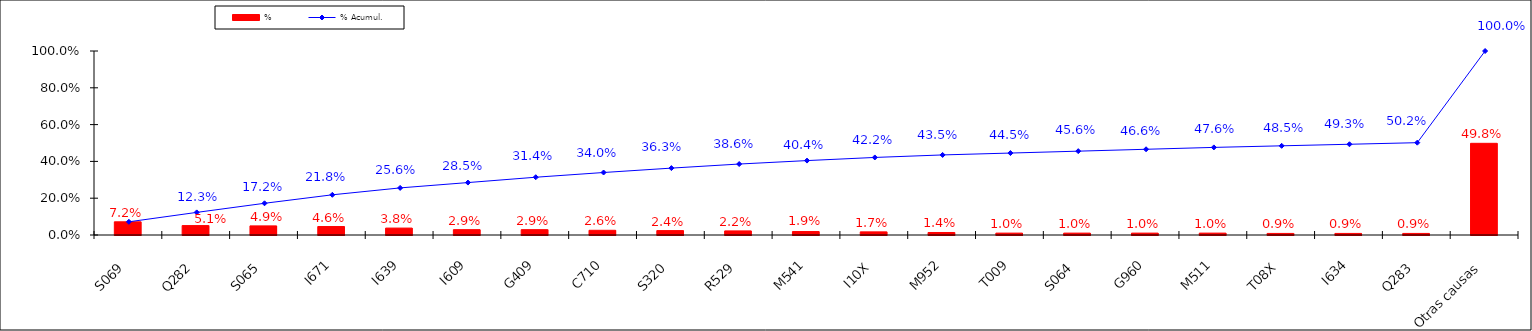
| Category | % |
|---|---|
| S069 | 0.072 |
| Q282 | 0.051 |
| S065 | 0.049 |
| I671 | 0.046 |
| I639 | 0.038 |
| I609 | 0.029 |
| G409 | 0.029 |
| C710 | 0.026 |
| S320 | 0.024 |
| R529 | 0.022 |
| M541 | 0.019 |
| I10X | 0.017 |
| M952 | 0.014 |
| T009 | 0.01 |
| S064 | 0.01 |
| G960 | 0.01 |
| M511 | 0.01 |
| T08X | 0.009 |
| I634 | 0.009 |
| Q283 | 0.009 |
| Otras causas | 0.498 |